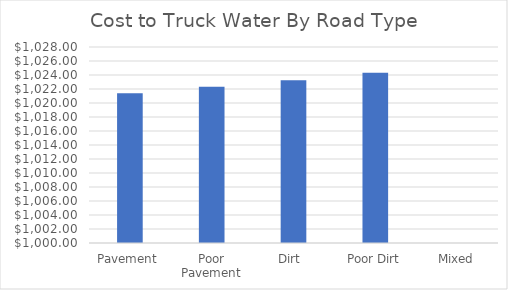
| Category | Series 0 |
|---|---|
| Pavement | 1021.386 |
| Poor Pavement | 1022.307 |
| Dirt  | 1023.246 |
| Poor Dirt | 1024.323 |
| Mixed | 0 |